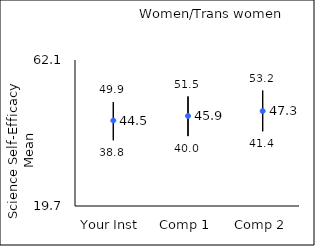
| Category | 25th percentile | 75th percentile | Mean |
|---|---|---|---|
| Your Inst | 38.8 | 49.9 | 44.52 |
| Comp 1 | 40 | 51.5 | 45.85 |
| Comp 2 | 41.4 | 53.2 | 47.27 |